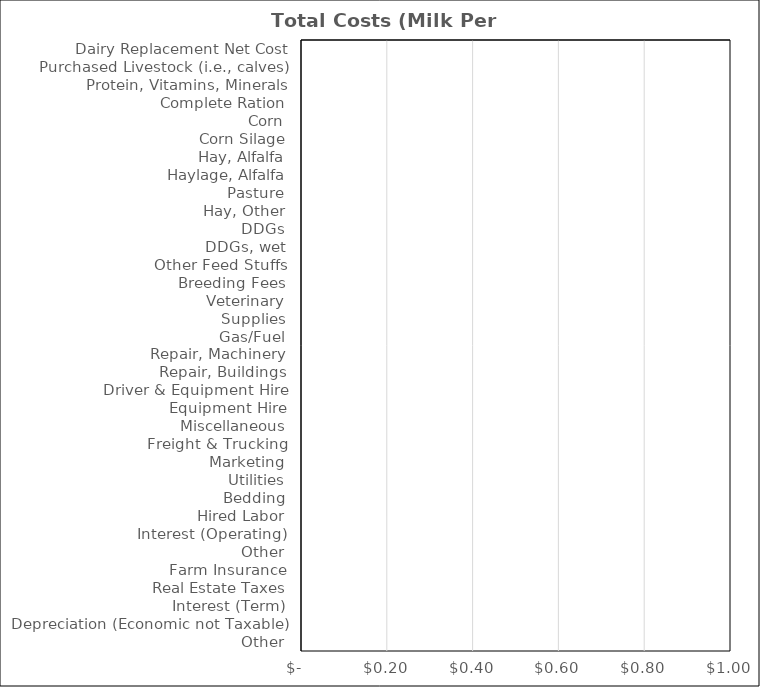
| Category | Beef Finishing |
|---|---|
| Dairy Replacement Net Cost | 0 |
| Purchased Livestock (i.e., calves) | 0 |
| Protein, Vitamins, Minerals | 0 |
| Complete Ration | 0 |
| Corn | 0 |
| Corn Silage | 0 |
| Hay, Alfalfa | 0 |
| Haylage, Alfalfa | 0 |
| Pasture | 0 |
| Hay, Other | 0 |
| DDGs | 0 |
| DDGs, wet | 0 |
| Other Feed Stuffs | 0 |
| Breeding Fees | 0 |
| Veterinary | 0 |
| Supplies | 0 |
| Gas/Fuel | 0 |
| Repair, Machinery | 0 |
| Repair, Buildings | 0 |
| Driver & Equipment Hire | 0 |
| Equipment Hire | 0 |
| Miscellaneous | 0 |
| Freight & Trucking | 0 |
| Marketing | 0 |
| Utilities | 0 |
| Bedding | 0 |
| Hired Labor | 0 |
| Interest (Operating) | 0 |
| Other | 0 |
| Farm Insurance | 0 |
| Real Estate Taxes | 0 |
| Interest (Term) | 0 |
| Depreciation (Economic not Taxable) | 0 |
| Other | 0 |